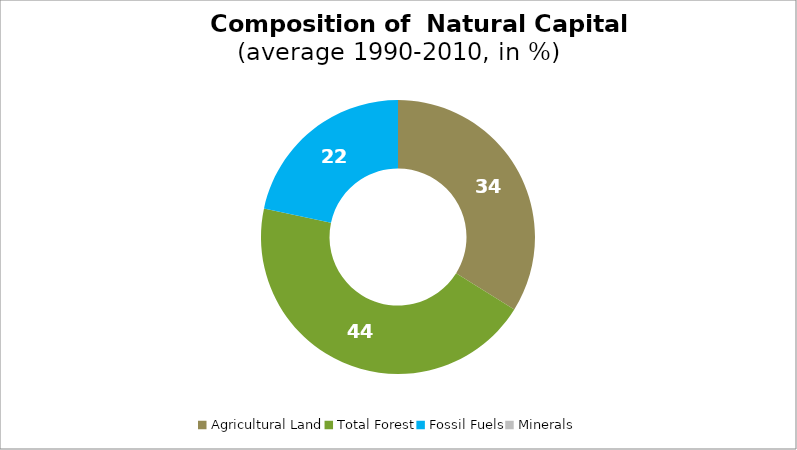
| Category | Series 0 |
|---|---|
| Agricultural Land | 33.87 |
| Total Forest | 44.468 |
| Fossil Fuels | 21.661 |
| Minerals | 0 |